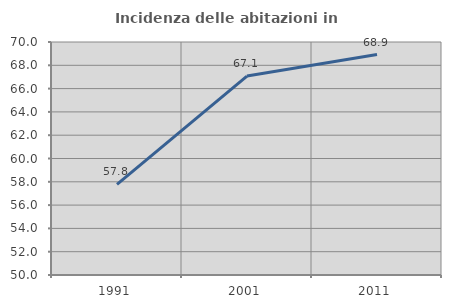
| Category | Incidenza delle abitazioni in proprietà  |
|---|---|
| 1991.0 | 57.772 |
| 2001.0 | 67.078 |
| 2011.0 | 68.925 |